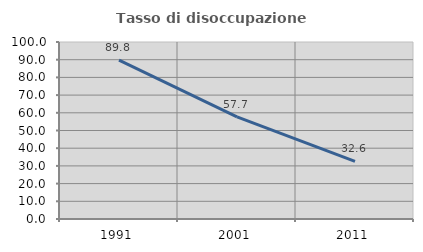
| Category | Tasso di disoccupazione giovanile  |
|---|---|
| 1991.0 | 89.796 |
| 2001.0 | 57.674 |
| 2011.0 | 32.571 |